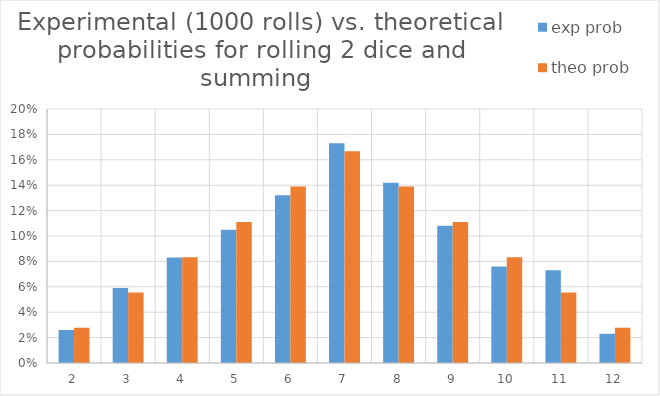
| Category | exp prob | theo prob |
|---|---|---|
| 2.0 | 0.026 | 0.028 |
| 3.0 | 0.059 | 0.056 |
| 4.0 | 0.083 | 0.083 |
| 5.0 | 0.105 | 0.111 |
| 6.0 | 0.132 | 0.139 |
| 7.0 | 0.173 | 0.167 |
| 8.0 | 0.142 | 0.139 |
| 9.0 | 0.108 | 0.111 |
| 10.0 | 0.076 | 0.083 |
| 11.0 | 0.073 | 0.056 |
| 12.0 | 0.023 | 0.028 |